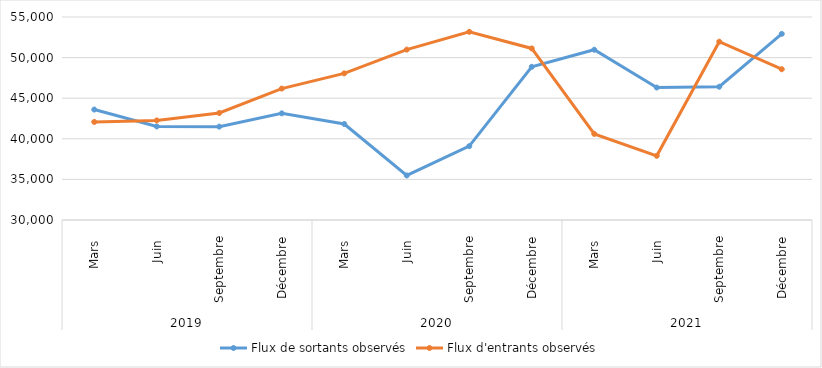
| Category |  Flux de sortants observés  |  Flux d'entrants observés  |
|---|---|---|
| 0 | 43607 | 42076 |
| 1 | 41520 | 42262 |
| 2 | 41499 | 43179 |
| 3 | 43135 | 46186 |
| 4 | 41822 | 48059 |
| 5 | 35485 | 50984 |
| 6 | 39094 | 53178 |
| 7 | 48866 | 51129 |
| 8 | 50968 | 40601 |
| 9 | 46313 | 37904 |
| 10 | 46413 | 51957 |
| 11 | 52922 | 48568 |